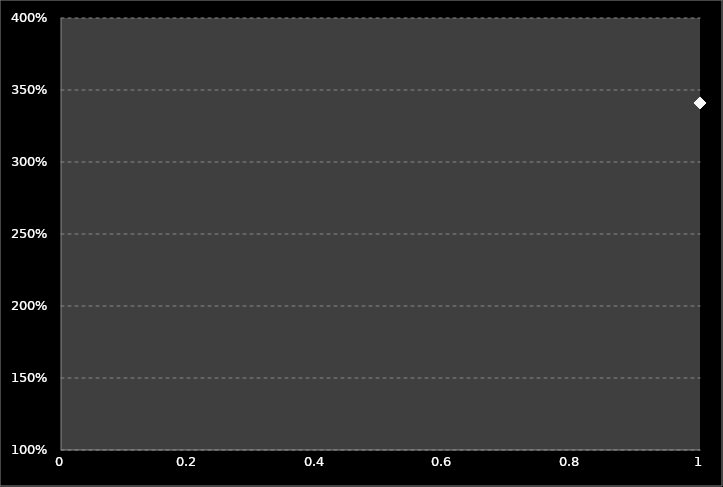
| Category | Series 0 |
|---|---|
| 0 | 3.41 |
| 1 | 1 |
| 2 | 1.17 |
| 3 | 1.12 |
| 4 | 0 |
| 5 | 1.98 |
| 6 | 1 |
| 7 | 1.87 |
| 8 | 1 |
| 9 | 1.78 |
| 10 | 1.4 |
| 11 | 1.24 |
| 12 | 0 |
| 13 | 1.2 |
| 14 | 1.89 |
| 15 | 1.32 |
| 16 | 1.86 |
| 17 | 1.85 |
| 18 | 2.83 |
| 19 | 2.17 |
| 20 | 1.2 |
| 21 | 1.56 |
| 22 | 2.46 |
| 23 | 1 |
| 24 | 2.47 |
| 25 | 1.97 |
| 26 | 1.18 |
| 27 | 2.3 |
| 28 | 3.34 |
| 29 | 1.21 |
| 30 | 2.73 |
| 31 | 1.03 |
| 32 | 1.53 |
| 33 | 1.58 |
| 34 | 2.2 |
| 35 | 1.19 |
| 36 | 2.1 |
| 37 | 1.06 |
| 38 | 1.5 |
| 39 | 1.17 |
| 40 | 1.1 |
| 41 | 1.2 |
| 42 | 1.13 |
| 43 | 2.8 |
| 44 | 1.2 |
| 45 | 1 |
| 46 | 3.09 |
| 47 | 0 |
| 48 | 1.32 |
| 49 | 1 |
| 50 | 1.12 |